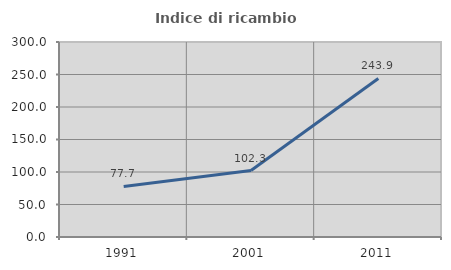
| Category | Indice di ricambio occupazionale  |
|---|---|
| 1991.0 | 77.731 |
| 2001.0 | 102.252 |
| 2011.0 | 243.902 |